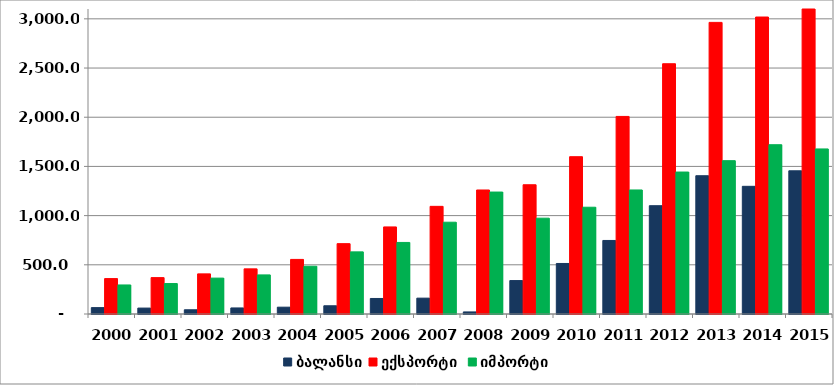
| Category | ბალანსი | ექსპორტი  | იმპორტი |
|---|---|---|---|
| 2000.0 | 64.798 | 359.974 | 295.176 |
| 2001.0 | 60.173 | 369.8 | 309.626 |
| 2002.0 | 42.999 | 407.779 | 364.78 |
| 2003.0 | 61.547 | 458.843 | 397.296 |
| 2004.0 | 69.318 | 554.762 | 485.444 |
| 2005.0 | 83.591 | 715.043 | 631.452 |
| 2006.0 | 157.824 | 885.086 | 727.262 |
| 2007.0 | 161.189 | 1094.109 | 932.92 |
| 2008.0 | 21.03 | 1260.454 | 1239.424 |
| 2009.0 | 339.726 | 1313.609 | 973.883 |
| 2010.0 | 513.454 | 1598.771 | 1085.317 |
| 2011.0 | 747.465 | 2008.157 | 1260.692 |
| 2012.0 | 1100.853 | 2543.662 | 1442.809 |
| 2013.0 | 1405.472 | 2964.033 | 1558.561 |
| 2014.0 | 1297.802 | 3018.497 | 1720.695 |
| 2015.0 | 1455.504 | 3133.234 | 1677.731 |